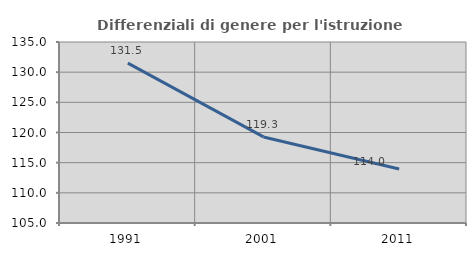
| Category | Differenziali di genere per l'istruzione superiore |
|---|---|
| 1991.0 | 131.502 |
| 2001.0 | 119.264 |
| 2011.0 | 113.955 |